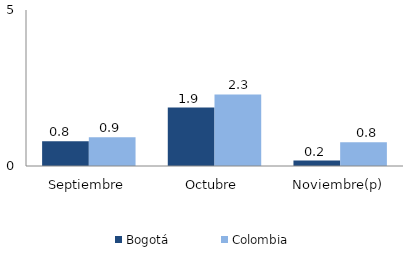
| Category | Bogotá | Colombia |
|---|---|---|
| Septiembre | 0.795 | 0.925 |
| Octubre | 1.875 | 2.293 |
| Noviembre(p) | 0.175 | 0.765 |